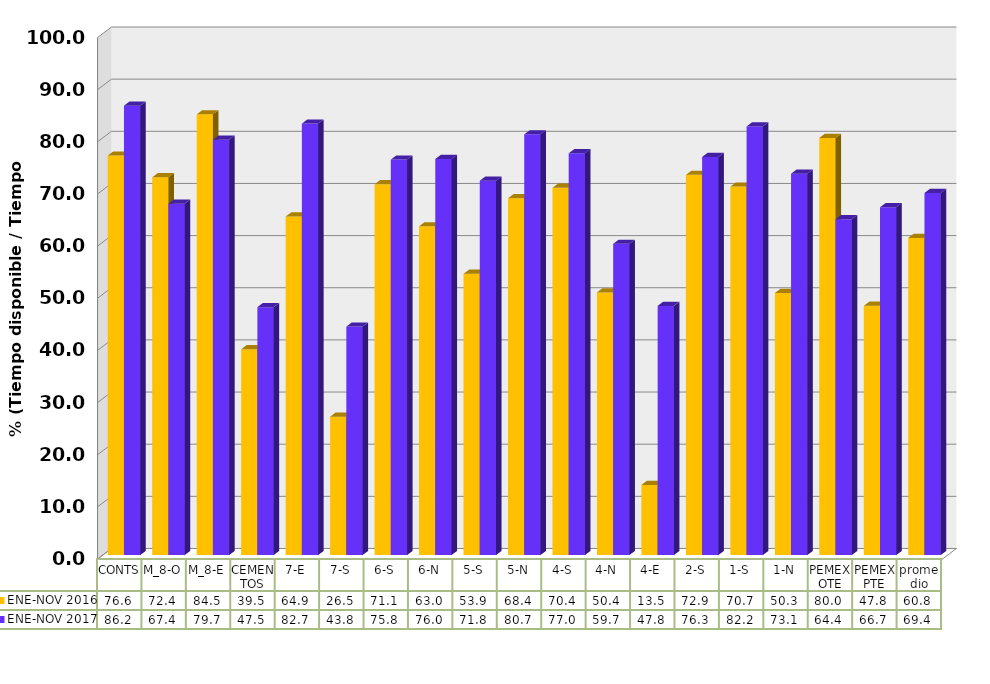
| Category | ENE-NOV 2016 | ENE-NOV 2017 |
|---|---|---|
| CONTS | 76.609 | 86.184 |
| M_8-O | 72.441 | 67.383 |
| M_8-E | 84.515 | 79.651 |
| CEMENTOS | 39.471 | 47.549 |
| 7-E | 64.918 | 82.745 |
| 7-S | 26.546 | 43.82 |
| 6-S | 71.114 | 75.841 |
| 6-N | 63.044 | 75.955 |
| 5-S | 53.938 | 71.788 |
| 5-N | 68.416 | 80.679 |
| 4-S | 70.427 | 77.044 |
| 4-N | 50.372 | 59.688 |
| 4-E | 13.454 | 47.79 |
| 2-S | 72.91 | 76.346 |
| 1-S | 70.661 | 82.202 |
| 1-N | 50.253 | 73.139 |
| PEMEX OTE | 80 | 64.4 |
| PEMEX PTE | 47.8 | 66.7 |
| promedio | 60.829 | 69.438 |